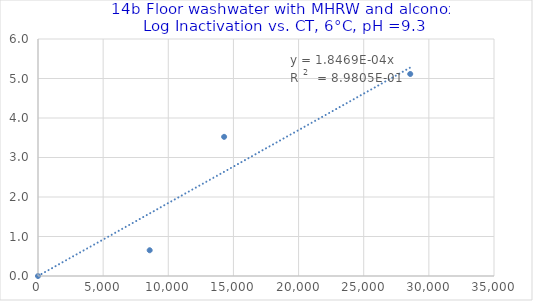
| Category | Series 0 |
|---|---|
| 0.0 | 0 |
| 8571.428571428572 | 0.652 |
| 14285.714285714286 | 3.523 |
| 28571.428571428572 | 5.114 |